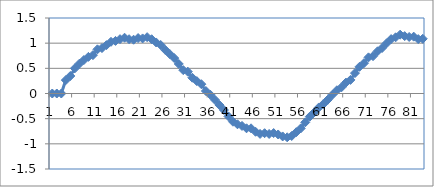
| Category | Series 0 |
|---|---|
| 0 | 0 |
| 1 | 0 |
| 2 | 0 |
| 3 | 0.266 |
| 4 | 0.348 |
| 5 | 0.5 |
| 6 | 0.592 |
| 7 | 0.665 |
| 8 | 0.728 |
| 9 | 0.762 |
| 10 | 0.878 |
| 11 | 0.902 |
| 12 | 0.961 |
| 13 | 1.027 |
| 14 | 1.044 |
| 15 | 1.08 |
| 16 | 1.108 |
| 17 | 1.079 |
| 18 | 1.068 |
| 19 | 1.101 |
| 20 | 1.094 |
| 21 | 1.119 |
| 22 | 1.078 |
| 23 | 1.014 |
| 24 | 0.964 |
| 25 | 0.867 |
| 26 | 0.784 |
| 27 | 0.704 |
| 28 | 0.587 |
| 29 | 0.464 |
| 30 | 0.433 |
| 31 | 0.313 |
| 32 | 0.246 |
| 33 | 0.185 |
| 34 | 0.05 |
| 35 | -0.026 |
| 36 | -0.126 |
| 37 | -0.229 |
| 38 | -0.329 |
| 39 | -0.455 |
| 40 | -0.561 |
| 41 | -0.612 |
| 42 | -0.644 |
| 43 | -0.691 |
| 44 | -0.692 |
| 45 | -0.761 |
| 46 | -0.803 |
| 47 | -0.788 |
| 48 | -0.804 |
| 49 | -0.786 |
| 50 | -0.814 |
| 51 | -0.853 |
| 52 | -0.87 |
| 53 | -0.844 |
| 54 | -0.769 |
| 55 | -0.693 |
| 56 | -0.573 |
| 57 | -0.46 |
| 58 | -0.373 |
| 59 | -0.277 |
| 60 | -0.21 |
| 61 | -0.122 |
| 62 | -0.025 |
| 63 | 0.064 |
| 64 | 0.122 |
| 65 | 0.216 |
| 66 | 0.27 |
| 67 | 0.405 |
| 68 | 0.53 |
| 69 | 0.603 |
| 70 | 0.718 |
| 71 | 0.741 |
| 72 | 0.838 |
| 73 | 0.904 |
| 74 | 0.997 |
| 75 | 1.081 |
| 76 | 1.116 |
| 77 | 1.169 |
| 78 | 1.14 |
| 79 | 1.123 |
| 80 | 1.129 |
| 81 | 1.08 |
| 82 | 1.087 |